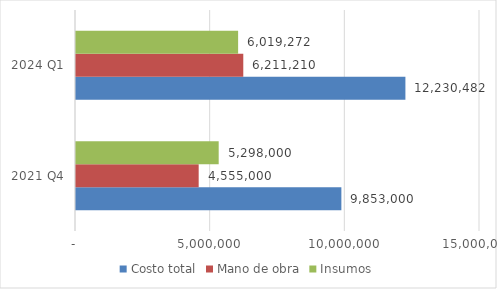
| Category | Costo total | Mano de obra | Insumos |
|---|---|---|---|
| 2021 Q4 | 9853000 | 4555000 | 5298000 |
| 2024 Q1 | 12230481.987 | 6211210 | 6019271.987 |